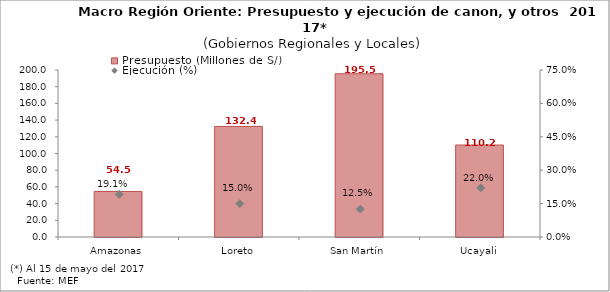
| Category | Presupuesto (Millones de S/) |
|---|---|
| Amazonas | 54.533 |
| Loreto | 132.394 |
| San Martín | 195.499 |
| Ucayali | 110.172 |